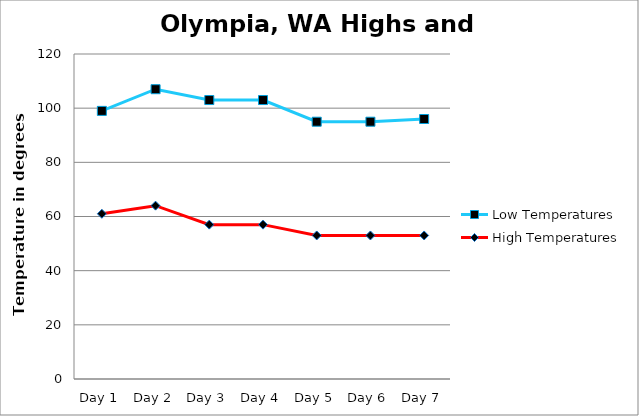
| Category | High Temperatures | Low Temperatures |
|---|---|---|
| Day 1 | 61 | 38 |
| Day 2 | 64 | 43 |
| Day 3 | 57 | 46 |
| Day 4 | 57 | 46 |
| Day 5 | 53 | 42 |
| Day 6 | 53 | 42 |
| Day 7 | 53 | 43 |